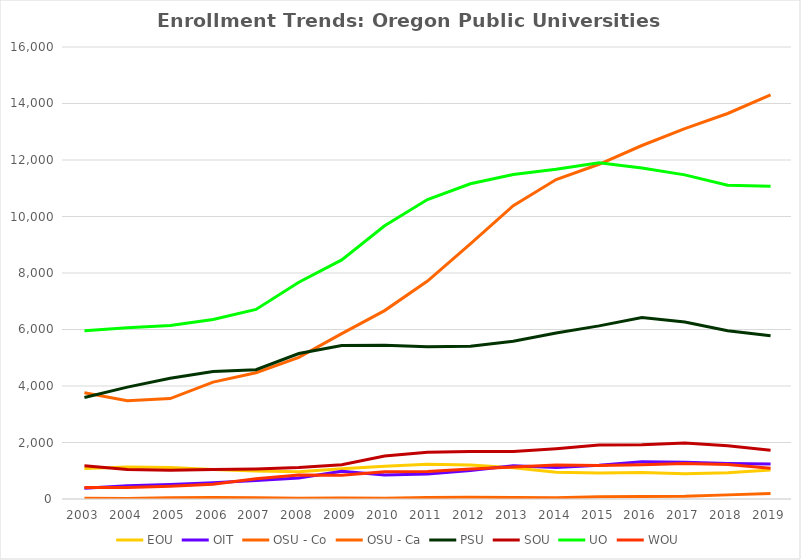
| Category | EOU | OIT | OSU - Co | OSU - Ca | PSU | SOU | UO | WOU |
|---|---|---|---|---|---|---|---|---|
| 2003.0 | 1078 | 384 | 3759 | 30 | 3591 | 1174 | 5954 | 403 |
| 2004.0 | 1136 | 467 | 3477 | 20 | 3960 | 1041 | 6065 | 403 |
| 2005.0 | 1118 | 512 | 3556 | 47 | 4272 | 1018 | 6143 | 451 |
| 2006.0 | 1041 | 574 | 4138 | 49 | 4517 | 1043 | 6355 | 519 |
| 2007.0 | 993 | 658 | 4471 | 40 | 4579 | 1062 | 6711 | 720 |
| 2008.0 | 969 | 740 | 5013 | 27 | 5148 | 1112 | 7672 | 853 |
| 2009.0 | 1074 | 984 | 5853 | 31 | 5432 | 1214 | 8462 | 844 |
| 2010.0 | 1160 | 852 | 6669 | 29 | 5442 | 1519 | 9670 | 965 |
| 2011.0 | 1232 | 887 | 7714 | 51 | 5390 | 1653 | 10600 | 971 |
| 2012.0 | 1203 | 1011 | 9030 | 60 | 5404 | 1678 | 11160 | 1060 |
| 2013.0 | 1105 | 1176 | 10381 | 50 | 5586 | 1681 | 11488 | 1132 |
| 2014.0 | 951 | 1116 | 11310 | 46 | 5877 | 1779 | 11671 | 1205 |
| 2015.0 | 918 | 1198 | 11849 | 77 | 6128 | 1910 | 11903 | 1186 |
| 2016.0 | 939 | 1317 | 12513 | 91 | 6427 | 1918 | 11720 | 1216 |
| 2017.0 | 895 | 1303 | 13110 | 98 | 6263 | 1981 | 11473 | 1257 |
| 2018.0 | 931 | 1258 | 13646 | 146 | 5959 | 1887 | 11106 | 1224 |
| 2019.0 | 1030 | 1240 | 14303 | 194 | 5776 | 1729 | 11075 | 1090 |